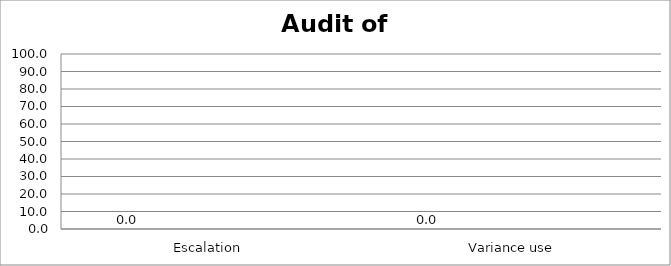
| Category | Series 0 | Series 1 | Series 2 | Series 3 |
|---|---|---|---|---|
| Escalation  | 0 |  |  |  |
|  Variance use | 0 |  |  |  |